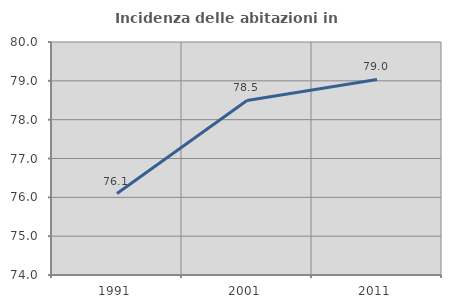
| Category | Incidenza delle abitazioni in proprietà  |
|---|---|
| 1991.0 | 76.099 |
| 2001.0 | 78.496 |
| 2011.0 | 79.035 |